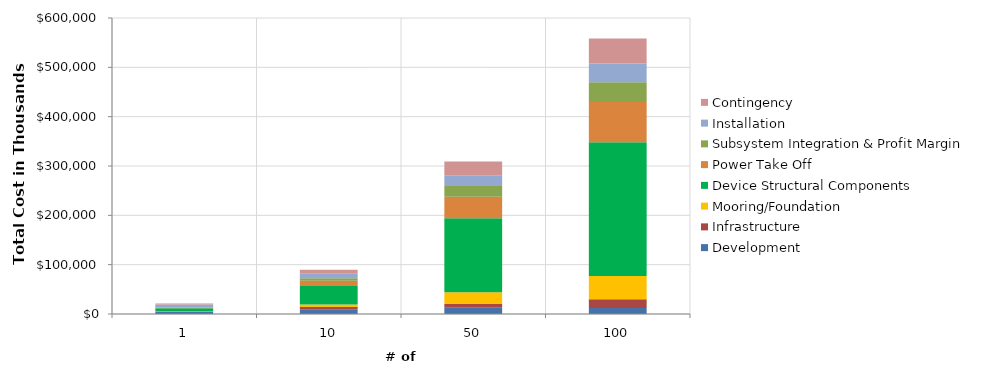
| Category | Development | Infrastructure | Mooring/Foundation | Device Structural Components | Power Take Off | Subsystem Integration & Profit Margin | Installation | Contingency |
|---|---|---|---|---|---|---|---|---|
| 1.0 | 4723 | 990 | 525 | 5266 | 1324 | 711 | 5909 | 1945 |
| 10.0 | 9528 | 4860 | 4723 | 37796 | 10252 | 5277 | 9082 | 8152 |
| 50.0 | 12821 | 7566 | 23615 | 149886 | 43849 | 21735 | 21531 | 28100 |
| 100.0 | 12336 | 17310 | 47230 | 271294 | 81488 | 40001 | 37860 | 50752 |